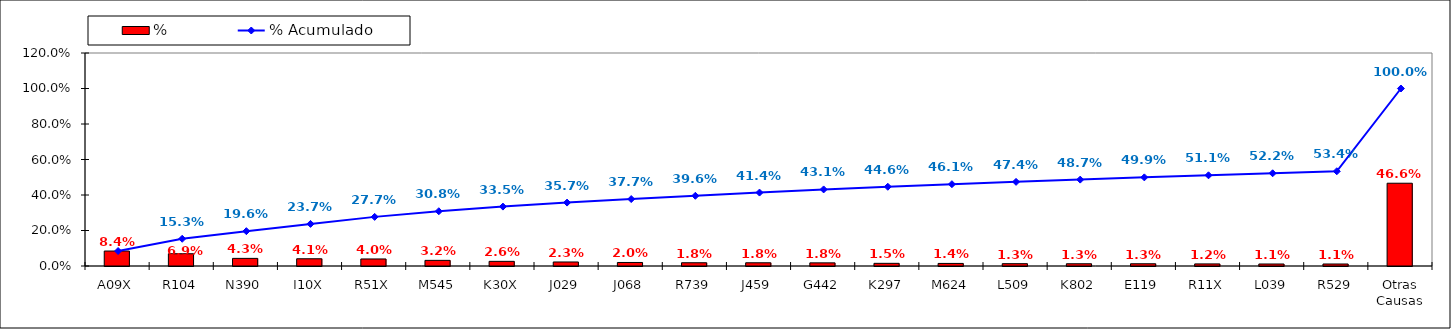
| Category | % |
|---|---|
| A09X | 0.084 |
| R104 | 0.069 |
| N390 | 0.043 |
| I10X | 0.041 |
| R51X | 0.04 |
| M545 | 0.032 |
| K30X | 0.026 |
| J029 | 0.023 |
| J068 | 0.02 |
| R739 | 0.018 |
| J459 | 0.018 |
| G442 | 0.018 |
| K297 | 0.015 |
| M624 | 0.014 |
| L509 | 0.013 |
| K802 | 0.013 |
| E119 | 0.013 |
| R11X | 0.012 |
| L039 | 0.011 |
| R529 | 0.011 |
| Otras Causas | 0.466 |